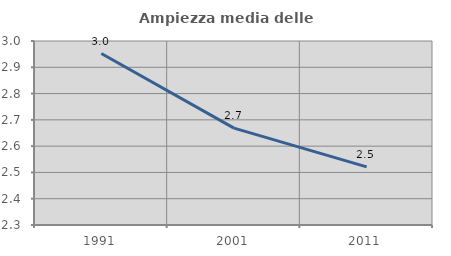
| Category | Ampiezza media delle famiglie |
|---|---|
| 1991.0 | 2.952 |
| 2001.0 | 2.669 |
| 2011.0 | 2.521 |